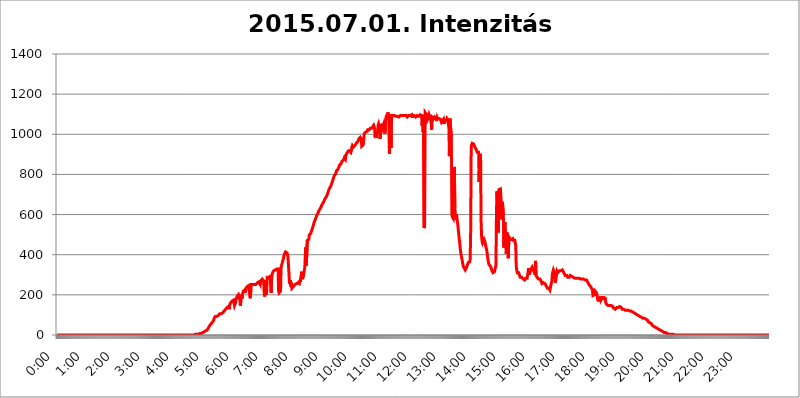
| Category | 2015.07.01. Intenzitás [W/m^2] |
|---|---|
| 0.0 | 0 |
| 0.0006944444444444445 | 0 |
| 0.001388888888888889 | 0 |
| 0.0020833333333333333 | 0 |
| 0.002777777777777778 | 0 |
| 0.003472222222222222 | 0 |
| 0.004166666666666667 | 0 |
| 0.004861111111111111 | 0 |
| 0.005555555555555556 | 0 |
| 0.0062499999999999995 | 0 |
| 0.006944444444444444 | 0 |
| 0.007638888888888889 | 0 |
| 0.008333333333333333 | 0 |
| 0.009027777777777779 | 0 |
| 0.009722222222222222 | 0 |
| 0.010416666666666666 | 0 |
| 0.011111111111111112 | 0 |
| 0.011805555555555555 | 0 |
| 0.012499999999999999 | 0 |
| 0.013194444444444444 | 0 |
| 0.013888888888888888 | 0 |
| 0.014583333333333332 | 0 |
| 0.015277777777777777 | 0 |
| 0.015972222222222224 | 0 |
| 0.016666666666666666 | 0 |
| 0.017361111111111112 | 0 |
| 0.018055555555555557 | 0 |
| 0.01875 | 0 |
| 0.019444444444444445 | 0 |
| 0.02013888888888889 | 0 |
| 0.020833333333333332 | 0 |
| 0.02152777777777778 | 0 |
| 0.022222222222222223 | 0 |
| 0.02291666666666667 | 0 |
| 0.02361111111111111 | 0 |
| 0.024305555555555556 | 0 |
| 0.024999999999999998 | 0 |
| 0.025694444444444447 | 0 |
| 0.02638888888888889 | 0 |
| 0.027083333333333334 | 0 |
| 0.027777777777777776 | 0 |
| 0.02847222222222222 | 0 |
| 0.029166666666666664 | 0 |
| 0.029861111111111113 | 0 |
| 0.030555555555555555 | 0 |
| 0.03125 | 0 |
| 0.03194444444444445 | 0 |
| 0.03263888888888889 | 0 |
| 0.03333333333333333 | 0 |
| 0.034027777777777775 | 0 |
| 0.034722222222222224 | 0 |
| 0.035416666666666666 | 0 |
| 0.036111111111111115 | 0 |
| 0.03680555555555556 | 0 |
| 0.0375 | 0 |
| 0.03819444444444444 | 0 |
| 0.03888888888888889 | 0 |
| 0.03958333333333333 | 0 |
| 0.04027777777777778 | 0 |
| 0.04097222222222222 | 0 |
| 0.041666666666666664 | 0 |
| 0.042361111111111106 | 0 |
| 0.04305555555555556 | 0 |
| 0.043750000000000004 | 0 |
| 0.044444444444444446 | 0 |
| 0.04513888888888889 | 0 |
| 0.04583333333333334 | 0 |
| 0.04652777777777778 | 0 |
| 0.04722222222222222 | 0 |
| 0.04791666666666666 | 0 |
| 0.04861111111111111 | 0 |
| 0.049305555555555554 | 0 |
| 0.049999999999999996 | 0 |
| 0.05069444444444445 | 0 |
| 0.051388888888888894 | 0 |
| 0.052083333333333336 | 0 |
| 0.05277777777777778 | 0 |
| 0.05347222222222222 | 0 |
| 0.05416666666666667 | 0 |
| 0.05486111111111111 | 0 |
| 0.05555555555555555 | 0 |
| 0.05625 | 0 |
| 0.05694444444444444 | 0 |
| 0.057638888888888885 | 0 |
| 0.05833333333333333 | 0 |
| 0.05902777777777778 | 0 |
| 0.059722222222222225 | 0 |
| 0.06041666666666667 | 0 |
| 0.061111111111111116 | 0 |
| 0.06180555555555556 | 0 |
| 0.0625 | 0 |
| 0.06319444444444444 | 0 |
| 0.06388888888888888 | 0 |
| 0.06458333333333334 | 0 |
| 0.06527777777777778 | 0 |
| 0.06597222222222222 | 0 |
| 0.06666666666666667 | 0 |
| 0.06736111111111111 | 0 |
| 0.06805555555555555 | 0 |
| 0.06874999999999999 | 0 |
| 0.06944444444444443 | 0 |
| 0.07013888888888889 | 0 |
| 0.07083333333333333 | 0 |
| 0.07152777777777779 | 0 |
| 0.07222222222222223 | 0 |
| 0.07291666666666667 | 0 |
| 0.07361111111111111 | 0 |
| 0.07430555555555556 | 0 |
| 0.075 | 0 |
| 0.07569444444444444 | 0 |
| 0.0763888888888889 | 0 |
| 0.07708333333333334 | 0 |
| 0.07777777777777778 | 0 |
| 0.07847222222222222 | 0 |
| 0.07916666666666666 | 0 |
| 0.0798611111111111 | 0 |
| 0.08055555555555556 | 0 |
| 0.08125 | 0 |
| 0.08194444444444444 | 0 |
| 0.08263888888888889 | 0 |
| 0.08333333333333333 | 0 |
| 0.08402777777777777 | 0 |
| 0.08472222222222221 | 0 |
| 0.08541666666666665 | 0 |
| 0.08611111111111112 | 0 |
| 0.08680555555555557 | 0 |
| 0.08750000000000001 | 0 |
| 0.08819444444444445 | 0 |
| 0.08888888888888889 | 0 |
| 0.08958333333333333 | 0 |
| 0.09027777777777778 | 0 |
| 0.09097222222222222 | 0 |
| 0.09166666666666667 | 0 |
| 0.09236111111111112 | 0 |
| 0.09305555555555556 | 0 |
| 0.09375 | 0 |
| 0.09444444444444444 | 0 |
| 0.09513888888888888 | 0 |
| 0.09583333333333333 | 0 |
| 0.09652777777777777 | 0 |
| 0.09722222222222222 | 0 |
| 0.09791666666666667 | 0 |
| 0.09861111111111111 | 0 |
| 0.09930555555555555 | 0 |
| 0.09999999999999999 | 0 |
| 0.10069444444444443 | 0 |
| 0.1013888888888889 | 0 |
| 0.10208333333333335 | 0 |
| 0.10277777777777779 | 0 |
| 0.10347222222222223 | 0 |
| 0.10416666666666667 | 0 |
| 0.10486111111111111 | 0 |
| 0.10555555555555556 | 0 |
| 0.10625 | 0 |
| 0.10694444444444444 | 0 |
| 0.1076388888888889 | 0 |
| 0.10833333333333334 | 0 |
| 0.10902777777777778 | 0 |
| 0.10972222222222222 | 0 |
| 0.1111111111111111 | 0 |
| 0.11180555555555556 | 0 |
| 0.11180555555555556 | 0 |
| 0.1125 | 0 |
| 0.11319444444444444 | 0 |
| 0.11388888888888889 | 0 |
| 0.11458333333333333 | 0 |
| 0.11527777777777777 | 0 |
| 0.11597222222222221 | 0 |
| 0.11666666666666665 | 0 |
| 0.1173611111111111 | 0 |
| 0.11805555555555557 | 0 |
| 0.11944444444444445 | 0 |
| 0.12013888888888889 | 0 |
| 0.12083333333333333 | 0 |
| 0.12152777777777778 | 0 |
| 0.12222222222222223 | 0 |
| 0.12291666666666667 | 0 |
| 0.12291666666666667 | 0 |
| 0.12361111111111112 | 0 |
| 0.12430555555555556 | 0 |
| 0.125 | 0 |
| 0.12569444444444444 | 0 |
| 0.12638888888888888 | 0 |
| 0.12708333333333333 | 0 |
| 0.16875 | 0 |
| 0.12847222222222224 | 0 |
| 0.12916666666666668 | 0 |
| 0.12986111111111112 | 0 |
| 0.13055555555555556 | 0 |
| 0.13125 | 0 |
| 0.13194444444444445 | 0 |
| 0.1326388888888889 | 0 |
| 0.13333333333333333 | 0 |
| 0.13402777777777777 | 0 |
| 0.13402777777777777 | 0 |
| 0.13472222222222222 | 0 |
| 0.13541666666666666 | 0 |
| 0.1361111111111111 | 0 |
| 0.13749999999999998 | 0 |
| 0.13819444444444443 | 0 |
| 0.1388888888888889 | 0 |
| 0.13958333333333334 | 0 |
| 0.14027777777777778 | 0 |
| 0.14097222222222222 | 0 |
| 0.14166666666666666 | 0 |
| 0.1423611111111111 | 0 |
| 0.14305555555555557 | 0 |
| 0.14375000000000002 | 0 |
| 0.14444444444444446 | 0 |
| 0.1451388888888889 | 0 |
| 0.1451388888888889 | 0 |
| 0.14652777777777778 | 0 |
| 0.14722222222222223 | 0 |
| 0.14791666666666667 | 0 |
| 0.1486111111111111 | 0 |
| 0.14930555555555555 | 0 |
| 0.15 | 0 |
| 0.15069444444444444 | 0 |
| 0.15138888888888888 | 0 |
| 0.15208333333333332 | 0 |
| 0.15277777777777776 | 0 |
| 0.15347222222222223 | 0 |
| 0.15416666666666667 | 0 |
| 0.15486111111111112 | 0 |
| 0.15555555555555556 | 0 |
| 0.15625 | 0 |
| 0.15694444444444444 | 0 |
| 0.15763888888888888 | 0 |
| 0.15833333333333333 | 0 |
| 0.15902777777777777 | 0 |
| 0.15972222222222224 | 0 |
| 0.16041666666666668 | 0 |
| 0.16111111111111112 | 0 |
| 0.16180555555555556 | 0 |
| 0.1625 | 0 |
| 0.16319444444444445 | 0 |
| 0.1638888888888889 | 0 |
| 0.16458333333333333 | 0 |
| 0.16527777777777777 | 0 |
| 0.16597222222222222 | 0 |
| 0.16666666666666666 | 0 |
| 0.1673611111111111 | 0 |
| 0.16805555555555554 | 0 |
| 0.16874999999999998 | 0 |
| 0.16944444444444443 | 0 |
| 0.17013888888888887 | 0 |
| 0.1708333333333333 | 0 |
| 0.17152777777777775 | 0 |
| 0.17222222222222225 | 0 |
| 0.1729166666666667 | 0 |
| 0.17361111111111113 | 0 |
| 0.17430555555555557 | 0 |
| 0.17500000000000002 | 0 |
| 0.17569444444444446 | 0 |
| 0.1763888888888889 | 0 |
| 0.17708333333333334 | 0 |
| 0.17777777777777778 | 0 |
| 0.17847222222222223 | 0 |
| 0.17916666666666667 | 0 |
| 0.1798611111111111 | 0 |
| 0.18055555555555555 | 0 |
| 0.18125 | 0 |
| 0.18194444444444444 | 0 |
| 0.1826388888888889 | 0 |
| 0.18333333333333335 | 0 |
| 0.1840277777777778 | 0 |
| 0.18472222222222223 | 0 |
| 0.18541666666666667 | 0 |
| 0.18611111111111112 | 0 |
| 0.18680555555555556 | 0 |
| 0.1875 | 0 |
| 0.18819444444444444 | 0 |
| 0.18888888888888888 | 0 |
| 0.18958333333333333 | 0 |
| 0.19027777777777777 | 0 |
| 0.1909722222222222 | 0 |
| 0.19166666666666665 | 0 |
| 0.19236111111111112 | 0 |
| 0.19305555555555554 | 0 |
| 0.19375 | 3.525 |
| 0.19444444444444445 | 3.525 |
| 0.1951388888888889 | 3.525 |
| 0.19583333333333333 | 3.525 |
| 0.19652777777777777 | 3.525 |
| 0.19722222222222222 | 3.525 |
| 0.19791666666666666 | 3.525 |
| 0.1986111111111111 | 3.525 |
| 0.19930555555555554 | 7.887 |
| 0.19999999999999998 | 7.887 |
| 0.20069444444444443 | 7.887 |
| 0.20138888888888887 | 7.887 |
| 0.2020833333333333 | 7.887 |
| 0.2027777777777778 | 12.257 |
| 0.2034722222222222 | 12.257 |
| 0.2041666666666667 | 12.257 |
| 0.20486111111111113 | 12.257 |
| 0.20555555555555557 | 12.257 |
| 0.20625000000000002 | 16.636 |
| 0.20694444444444446 | 16.636 |
| 0.2076388888888889 | 16.636 |
| 0.20833333333333334 | 21.024 |
| 0.20902777777777778 | 21.024 |
| 0.20972222222222223 | 25.419 |
| 0.21041666666666667 | 25.419 |
| 0.2111111111111111 | 29.823 |
| 0.21180555555555555 | 29.823 |
| 0.2125 | 38.653 |
| 0.21319444444444444 | 43.079 |
| 0.2138888888888889 | 47.511 |
| 0.21458333333333335 | 47.511 |
| 0.2152777777777778 | 51.951 |
| 0.21597222222222223 | 56.398 |
| 0.21666666666666667 | 56.398 |
| 0.21736111111111112 | 60.85 |
| 0.21805555555555556 | 65.31 |
| 0.21875 | 69.775 |
| 0.21944444444444444 | 74.246 |
| 0.22013888888888888 | 83.205 |
| 0.22083333333333333 | 87.692 |
| 0.22152777777777777 | 92.184 |
| 0.2222222222222222 | 92.184 |
| 0.22291666666666665 | 92.184 |
| 0.2236111111111111 | 92.184 |
| 0.22430555555555556 | 96.682 |
| 0.225 | 96.682 |
| 0.22569444444444445 | 96.682 |
| 0.2263888888888889 | 101.184 |
| 0.22708333333333333 | 101.184 |
| 0.22777777777777777 | 105.69 |
| 0.22847222222222222 | 105.69 |
| 0.22916666666666666 | 105.69 |
| 0.2298611111111111 | 105.69 |
| 0.23055555555555554 | 105.69 |
| 0.23124999999999998 | 110.201 |
| 0.23194444444444443 | 110.201 |
| 0.23263888888888887 | 114.716 |
| 0.2333333333333333 | 114.716 |
| 0.2340277777777778 | 119.235 |
| 0.2347222222222222 | 119.235 |
| 0.2354166666666667 | 123.758 |
| 0.23611111111111113 | 128.284 |
| 0.23680555555555557 | 128.284 |
| 0.23750000000000002 | 132.814 |
| 0.23819444444444446 | 137.347 |
| 0.2388888888888889 | 137.347 |
| 0.23958333333333334 | 137.347 |
| 0.24027777777777778 | 141.884 |
| 0.24097222222222223 | 128.284 |
| 0.24166666666666667 | 146.423 |
| 0.2423611111111111 | 141.884 |
| 0.24305555555555555 | 160.056 |
| 0.24375 | 160.056 |
| 0.24444444444444446 | 164.605 |
| 0.24513888888888888 | 169.156 |
| 0.24583333333333335 | 173.709 |
| 0.2465277777777778 | 173.709 |
| 0.24722222222222223 | 173.709 |
| 0.24791666666666667 | 173.709 |
| 0.24861111111111112 | 146.423 |
| 0.24930555555555556 | 141.884 |
| 0.25 | 160.056 |
| 0.25069444444444444 | 173.709 |
| 0.2513888888888889 | 182.82 |
| 0.2520833333333333 | 191.937 |
| 0.25277777777777777 | 196.497 |
| 0.2534722222222222 | 196.497 |
| 0.25416666666666665 | 201.058 |
| 0.2548611111111111 | 201.058 |
| 0.2555555555555556 | 201.058 |
| 0.25625000000000003 | 173.709 |
| 0.2569444444444445 | 146.423 |
| 0.2576388888888889 | 182.82 |
| 0.25833333333333336 | 201.058 |
| 0.2590277777777778 | 182.82 |
| 0.25972222222222224 | 201.058 |
| 0.2604166666666667 | 210.182 |
| 0.2611111111111111 | 219.309 |
| 0.26180555555555557 | 223.873 |
| 0.2625 | 223.873 |
| 0.26319444444444445 | 223.873 |
| 0.2638888888888889 | 210.182 |
| 0.26458333333333334 | 233 |
| 0.2652777777777778 | 237.564 |
| 0.2659722222222222 | 237.564 |
| 0.26666666666666666 | 242.127 |
| 0.2673611111111111 | 242.127 |
| 0.26805555555555555 | 242.127 |
| 0.26875 | 246.689 |
| 0.26944444444444443 | 246.689 |
| 0.2701388888888889 | 191.937 |
| 0.2708333333333333 | 182.82 |
| 0.27152777777777776 | 233 |
| 0.2722222222222222 | 251.251 |
| 0.27291666666666664 | 251.251 |
| 0.2736111111111111 | 251.251 |
| 0.2743055555555555 | 251.251 |
| 0.27499999999999997 | 255.813 |
| 0.27569444444444446 | 251.251 |
| 0.27638888888888885 | 251.251 |
| 0.27708333333333335 | 251.251 |
| 0.2777777777777778 | 251.251 |
| 0.27847222222222223 | 251.251 |
| 0.2791666666666667 | 255.813 |
| 0.2798611111111111 | 255.813 |
| 0.28055555555555556 | 260.373 |
| 0.28125 | 260.373 |
| 0.28194444444444444 | 264.932 |
| 0.2826388888888889 | 264.932 |
| 0.2833333333333333 | 269.49 |
| 0.28402777777777777 | 269.49 |
| 0.2847222222222222 | 251.251 |
| 0.28541666666666665 | 269.49 |
| 0.28611111111111115 | 274.047 |
| 0.28680555555555554 | 274.047 |
| 0.28750000000000003 | 278.603 |
| 0.2881944444444445 | 274.047 |
| 0.2888888888888889 | 274.047 |
| 0.28958333333333336 | 269.49 |
| 0.2902777777777778 | 205.62 |
| 0.29097222222222224 | 191.937 |
| 0.2916666666666667 | 223.873 |
| 0.2923611111111111 | 274.047 |
| 0.29305555555555557 | 201.058 |
| 0.29375 | 219.309 |
| 0.29444444444444445 | 287.709 |
| 0.2951388888888889 | 292.259 |
| 0.29583333333333334 | 292.259 |
| 0.2965277777777778 | 287.709 |
| 0.2972222222222222 | 287.709 |
| 0.29791666666666666 | 287.709 |
| 0.2986111111111111 | 292.259 |
| 0.29930555555555555 | 287.709 |
| 0.3 | 210.182 |
| 0.30069444444444443 | 278.603 |
| 0.3013888888888889 | 301.354 |
| 0.3020833333333333 | 310.44 |
| 0.30277777777777776 | 314.98 |
| 0.3034722222222222 | 319.517 |
| 0.30416666666666664 | 324.052 |
| 0.3048611111111111 | 324.052 |
| 0.3055555555555555 | 324.052 |
| 0.30624999999999997 | 328.584 |
| 0.3069444444444444 | 328.584 |
| 0.3076388888888889 | 328.584 |
| 0.30833333333333335 | 328.584 |
| 0.3090277777777778 | 328.584 |
| 0.30972222222222223 | 328.584 |
| 0.3104166666666667 | 219.309 |
| 0.3111111111111111 | 210.182 |
| 0.31180555555555556 | 205.62 |
| 0.3125 | 210.182 |
| 0.31319444444444444 | 219.309 |
| 0.3138888888888889 | 337.639 |
| 0.3145833333333333 | 346.682 |
| 0.31527777777777777 | 351.198 |
| 0.3159722222222222 | 364.728 |
| 0.31666666666666665 | 373.729 |
| 0.31736111111111115 | 382.715 |
| 0.31805555555555554 | 396.164 |
| 0.31875000000000003 | 405.108 |
| 0.3194444444444445 | 405.108 |
| 0.3201388888888889 | 414.035 |
| 0.32083333333333336 | 414.035 |
| 0.3215277777777778 | 414.035 |
| 0.32222222222222224 | 409.574 |
| 0.3229166666666667 | 400.638 |
| 0.3236111111111111 | 387.202 |
| 0.32430555555555557 | 382.715 |
| 0.325 | 305.898 |
| 0.32569444444444445 | 255.813 |
| 0.3263888888888889 | 255.813 |
| 0.32708333333333334 | 274.047 |
| 0.3277777777777778 | 242.127 |
| 0.3284722222222222 | 260.373 |
| 0.32916666666666666 | 233 |
| 0.3298611111111111 | 228.436 |
| 0.33055555555555555 | 233 |
| 0.33125 | 242.127 |
| 0.33194444444444443 | 242.127 |
| 0.3326388888888889 | 242.127 |
| 0.3333333333333333 | 251.251 |
| 0.3340277777777778 | 255.813 |
| 0.3347222222222222 | 251.251 |
| 0.3354166666666667 | 255.813 |
| 0.3361111111111111 | 255.813 |
| 0.3368055555555556 | 255.813 |
| 0.33749999999999997 | 260.373 |
| 0.33819444444444446 | 260.373 |
| 0.33888888888888885 | 260.373 |
| 0.33958333333333335 | 255.813 |
| 0.34027777777777773 | 274.047 |
| 0.34097222222222223 | 264.932 |
| 0.3416666666666666 | 264.932 |
| 0.3423611111111111 | 269.49 |
| 0.3430555555555555 | 314.98 |
| 0.34375 | 278.603 |
| 0.3444444444444445 | 274.047 |
| 0.3451388888888889 | 292.259 |
| 0.3458333333333334 | 287.709 |
| 0.34652777777777777 | 287.709 |
| 0.34722222222222227 | 337.639 |
| 0.34791666666666665 | 400.638 |
| 0.34861111111111115 | 436.27 |
| 0.34930555555555554 | 346.682 |
| 0.35000000000000003 | 346.682 |
| 0.3506944444444444 | 471.582 |
| 0.3513888888888889 | 471.582 |
| 0.3520833333333333 | 475.972 |
| 0.3527777777777778 | 475.972 |
| 0.3534722222222222 | 497.836 |
| 0.3541666666666667 | 497.836 |
| 0.3548611111111111 | 502.192 |
| 0.35555555555555557 | 506.542 |
| 0.35625 | 515.223 |
| 0.35694444444444445 | 519.555 |
| 0.3576388888888889 | 528.2 |
| 0.35833333333333334 | 536.82 |
| 0.3590277777777778 | 545.416 |
| 0.3597222222222222 | 553.986 |
| 0.36041666666666666 | 562.53 |
| 0.3611111111111111 | 566.793 |
| 0.36180555555555555 | 575.299 |
| 0.3625 | 579.542 |
| 0.36319444444444443 | 588.009 |
| 0.3638888888888889 | 592.233 |
| 0.3645833333333333 | 600.661 |
| 0.3652777777777778 | 604.864 |
| 0.3659722222222222 | 609.062 |
| 0.3666666666666667 | 617.436 |
| 0.3673611111111111 | 617.436 |
| 0.3680555555555556 | 621.613 |
| 0.36874999999999997 | 629.948 |
| 0.36944444444444446 | 634.105 |
| 0.37013888888888885 | 638.256 |
| 0.37083333333333335 | 646.537 |
| 0.37152777777777773 | 650.667 |
| 0.37222222222222223 | 654.791 |
| 0.3729166666666666 | 658.909 |
| 0.3736111111111111 | 663.019 |
| 0.3743055555555555 | 667.123 |
| 0.375 | 675.311 |
| 0.3756944444444445 | 679.395 |
| 0.3763888888888889 | 683.473 |
| 0.3770833333333334 | 687.544 |
| 0.37777777777777777 | 691.608 |
| 0.37847222222222227 | 695.666 |
| 0.37916666666666665 | 703.762 |
| 0.37986111111111115 | 711.832 |
| 0.38055555555555554 | 719.877 |
| 0.38125000000000003 | 723.889 |
| 0.3819444444444444 | 731.896 |
| 0.3826388888888889 | 735.89 |
| 0.3833333333333333 | 739.877 |
| 0.3840277777777778 | 743.859 |
| 0.3847222222222222 | 751.803 |
| 0.3854166666666667 | 759.723 |
| 0.3861111111111111 | 767.62 |
| 0.38680555555555557 | 775.492 |
| 0.3875 | 783.342 |
| 0.38819444444444445 | 791.169 |
| 0.3888888888888889 | 795.074 |
| 0.38958333333333334 | 798.974 |
| 0.3902777777777778 | 802.868 |
| 0.3909722222222222 | 806.757 |
| 0.39166666666666666 | 818.392 |
| 0.3923611111111111 | 818.392 |
| 0.39305555555555555 | 822.26 |
| 0.39375 | 826.123 |
| 0.39444444444444443 | 829.981 |
| 0.3951388888888889 | 837.682 |
| 0.3958333333333333 | 845.365 |
| 0.3965277777777778 | 845.365 |
| 0.3972222222222222 | 845.365 |
| 0.3979166666666667 | 853.029 |
| 0.3986111111111111 | 860.676 |
| 0.3993055555555556 | 864.493 |
| 0.39999999999999997 | 868.305 |
| 0.40069444444444446 | 868.305 |
| 0.40138888888888885 | 868.305 |
| 0.40208333333333335 | 875.918 |
| 0.40277777777777773 | 883.516 |
| 0.40347222222222223 | 883.516 |
| 0.4041666666666666 | 875.918 |
| 0.4048611111111111 | 894.885 |
| 0.4055555555555555 | 898.668 |
| 0.40625 | 906.223 |
| 0.4069444444444445 | 909.996 |
| 0.4076388888888889 | 909.996 |
| 0.4083333333333334 | 917.534 |
| 0.40902777777777777 | 913.766 |
| 0.40972222222222227 | 921.298 |
| 0.41041666666666665 | 917.534 |
| 0.41111111111111115 | 913.766 |
| 0.41180555555555554 | 909.996 |
| 0.41250000000000003 | 917.534 |
| 0.4131944444444444 | 936.33 |
| 0.4138888888888889 | 943.832 |
| 0.4145833333333333 | 943.832 |
| 0.4152777777777778 | 936.33 |
| 0.4159722222222222 | 936.33 |
| 0.4166666666666667 | 940.082 |
| 0.4173611111111111 | 943.832 |
| 0.41805555555555557 | 947.58 |
| 0.41875 | 951.327 |
| 0.41944444444444445 | 955.071 |
| 0.4201388888888889 | 958.814 |
| 0.42083333333333334 | 962.555 |
| 0.4215277777777778 | 962.555 |
| 0.4222222222222222 | 966.295 |
| 0.42291666666666666 | 977.508 |
| 0.4236111111111111 | 977.508 |
| 0.42430555555555555 | 981.244 |
| 0.425 | 984.98 |
| 0.42569444444444443 | 984.98 |
| 0.4263888888888889 | 977.508 |
| 0.4270833333333333 | 940.082 |
| 0.4277777777777778 | 936.33 |
| 0.4284722222222222 | 936.33 |
| 0.4291666666666667 | 947.58 |
| 0.4298611111111111 | 970.034 |
| 0.4305555555555556 | 1003.65 |
| 0.43124999999999997 | 1007.383 |
| 0.43194444444444446 | 1007.383 |
| 0.43263888888888885 | 1011.118 |
| 0.43333333333333335 | 1014.852 |
| 0.43402777777777773 | 1011.118 |
| 0.43472222222222223 | 1014.852 |
| 0.4354166666666666 | 1022.323 |
| 0.4361111111111111 | 1022.323 |
| 0.4368055555555555 | 1022.323 |
| 0.4375 | 1022.323 |
| 0.4381944444444445 | 1026.06 |
| 0.4388888888888889 | 1029.798 |
| 0.4395833333333334 | 1029.798 |
| 0.44027777777777777 | 1029.798 |
| 0.44097222222222227 | 1029.798 |
| 0.44166666666666665 | 1033.537 |
| 0.44236111111111115 | 1037.277 |
| 0.44305555555555554 | 1037.277 |
| 0.44375000000000003 | 1044.762 |
| 0.4444444444444444 | 1037.277 |
| 0.4451388888888889 | 1029.798 |
| 0.4458333333333333 | 984.98 |
| 0.4465277777777778 | 1007.383 |
| 0.4472222222222222 | 981.244 |
| 0.4479166666666667 | 1007.383 |
| 0.4486111111111111 | 1003.65 |
| 0.44930555555555557 | 1014.852 |
| 0.45 | 1044.762 |
| 0.45069444444444445 | 1052.255 |
| 0.4513888888888889 | 1048.508 |
| 0.45208333333333334 | 1029.798 |
| 0.4527777777777778 | 977.508 |
| 0.4534722222222222 | 1029.798 |
| 0.45416666666666666 | 1052.255 |
| 0.4548611111111111 | 1052.255 |
| 0.45555555555555555 | 1048.508 |
| 0.45625 | 1029.798 |
| 0.45694444444444443 | 1041.019 |
| 0.4576388888888889 | 1048.508 |
| 0.4583333333333333 | 1037.277 |
| 0.4590277777777778 | 1041.019 |
| 0.4597222222222222 | 1003.65 |
| 0.4604166666666667 | 1071.027 |
| 0.4611111111111111 | 1082.324 |
| 0.4618055555555556 | 1097.437 |
| 0.46249999999999997 | 1101.226 |
| 0.46319444444444446 | 1082.324 |
| 0.46388888888888885 | 1108.816 |
| 0.46458333333333335 | 1071.027 |
| 0.46527777777777773 | 1093.653 |
| 0.46597222222222223 | 902.447 |
| 0.4666666666666666 | 1093.653 |
| 0.4673611111111111 | 1101.226 |
| 0.4680555555555555 | 932.576 |
| 0.46875 | 1082.324 |
| 0.4694444444444445 | 1082.324 |
| 0.4701388888888889 | 1086.097 |
| 0.4708333333333334 | 1093.653 |
| 0.47152777777777777 | 1093.653 |
| 0.47222222222222227 | 1093.653 |
| 0.47291666666666665 | 1093.653 |
| 0.47361111111111115 | 1089.873 |
| 0.47430555555555554 | 1089.873 |
| 0.47500000000000003 | 1089.873 |
| 0.4756944444444444 | 1089.873 |
| 0.4763888888888889 | 1089.873 |
| 0.4770833333333333 | 1089.873 |
| 0.4777777777777778 | 1089.873 |
| 0.4784722222222222 | 1089.873 |
| 0.4791666666666667 | 1086.097 |
| 0.4798611111111111 | 1086.097 |
| 0.48055555555555557 | 1089.873 |
| 0.48125 | 1093.653 |
| 0.48194444444444445 | 1093.653 |
| 0.4826388888888889 | 1093.653 |
| 0.48333333333333334 | 1093.653 |
| 0.4840277777777778 | 1093.653 |
| 0.4847222222222222 | 1093.653 |
| 0.48541666666666666 | 1093.653 |
| 0.4861111111111111 | 1093.653 |
| 0.48680555555555555 | 1093.653 |
| 0.4875 | 1093.653 |
| 0.48819444444444443 | 1093.653 |
| 0.4888888888888889 | 1093.653 |
| 0.4895833333333333 | 1093.653 |
| 0.4902777777777778 | 1093.653 |
| 0.4909722222222222 | 1086.097 |
| 0.4916666666666667 | 1089.873 |
| 0.4923611111111111 | 1086.097 |
| 0.4930555555555556 | 1093.653 |
| 0.49374999999999997 | 1093.653 |
| 0.49444444444444446 | 1097.437 |
| 0.49513888888888885 | 1093.653 |
| 0.49583333333333335 | 1093.653 |
| 0.49652777777777773 | 1097.437 |
| 0.49722222222222223 | 1097.437 |
| 0.4979166666666666 | 1082.324 |
| 0.4986111111111111 | 1089.873 |
| 0.4993055555555555 | 1093.653 |
| 0.5 | 1086.097 |
| 0.5006944444444444 | 1093.653 |
| 0.5013888888888889 | 1097.437 |
| 0.5020833333333333 | 1093.653 |
| 0.5027777777777778 | 1086.097 |
| 0.5034722222222222 | 1082.324 |
| 0.5041666666666667 | 1082.324 |
| 0.5048611111111111 | 1093.653 |
| 0.5055555555555555 | 1093.653 |
| 0.50625 | 1097.437 |
| 0.5069444444444444 | 1089.873 |
| 0.5076388888888889 | 1093.653 |
| 0.5083333333333333 | 1093.653 |
| 0.5090277777777777 | 1097.437 |
| 0.5097222222222222 | 1101.226 |
| 0.5104166666666666 | 1097.437 |
| 0.5111111111111112 | 1089.873 |
| 0.5118055555555555 | 1041.019 |
| 0.5125000000000001 | 1097.437 |
| 0.5131944444444444 | 1011.118 |
| 0.513888888888889 | 1029.798 |
| 0.5145833333333333 | 532.513 |
| 0.5152777777777778 | 545.416 |
| 0.5159722222222222 | 1108.816 |
| 0.5166666666666667 | 1108.816 |
| 0.517361111111111 | 1101.226 |
| 0.5180555555555556 | 1101.226 |
| 0.5187499999999999 | 1093.653 |
| 0.5194444444444445 | 1074.789 |
| 0.5201388888888888 | 1074.789 |
| 0.5208333333333334 | 1086.097 |
| 0.5215277777777778 | 1097.437 |
| 0.5222222222222223 | 1089.873 |
| 0.5229166666666667 | 1082.324 |
| 0.5236111111111111 | 1082.324 |
| 0.5243055555555556 | 1093.653 |
| 0.525 | 1022.323 |
| 0.5256944444444445 | 1086.097 |
| 0.5263888888888889 | 1082.324 |
| 0.5270833333333333 | 1082.324 |
| 0.5277777777777778 | 1078.555 |
| 0.5284722222222222 | 1082.324 |
| 0.5291666666666667 | 1086.097 |
| 0.5298611111111111 | 1089.873 |
| 0.5305555555555556 | 1078.555 |
| 0.53125 | 1089.873 |
| 0.5319444444444444 | 1071.027 |
| 0.5326388888888889 | 1082.324 |
| 0.5333333333333333 | 1074.789 |
| 0.5340277777777778 | 1074.789 |
| 0.5347222222222222 | 1074.789 |
| 0.5354166666666667 | 1078.555 |
| 0.5361111111111111 | 1074.789 |
| 0.5368055555555555 | 1074.789 |
| 0.5375 | 1074.789 |
| 0.5381944444444444 | 1067.267 |
| 0.5388888888888889 | 1059.756 |
| 0.5395833333333333 | 1059.756 |
| 0.5402777777777777 | 1067.267 |
| 0.5409722222222222 | 1071.027 |
| 0.5416666666666666 | 1074.789 |
| 0.5423611111111112 | 1052.255 |
| 0.5430555555555555 | 1074.789 |
| 0.5437500000000001 | 1063.51 |
| 0.5444444444444444 | 1063.51 |
| 0.545138888888889 | 1067.267 |
| 0.5458333333333333 | 1071.027 |
| 0.5465277777777778 | 1078.555 |
| 0.5472222222222222 | 1074.789 |
| 0.5479166666666667 | 1071.027 |
| 0.548611111111111 | 1074.789 |
| 0.5493055555555556 | 1029.798 |
| 0.5499999999999999 | 891.099 |
| 0.5506944444444445 | 1078.555 |
| 0.5513888888888888 | 1074.789 |
| 0.5520833333333334 | 1074.789 |
| 0.5527777777777778 | 984.98 |
| 0.5534722222222223 | 600.661 |
| 0.5541666666666667 | 588.009 |
| 0.5548611111111111 | 583.779 |
| 0.5555555555555556 | 579.542 |
| 0.55625 | 609.062 |
| 0.5569444444444445 | 837.682 |
| 0.5576388888888889 | 629.948 |
| 0.5583333333333333 | 604.864 |
| 0.5590277777777778 | 575.299 |
| 0.5597222222222222 | 600.661 |
| 0.5604166666666667 | 592.233 |
| 0.5611111111111111 | 566.793 |
| 0.5618055555555556 | 549.704 |
| 0.5625 | 523.88 |
| 0.5631944444444444 | 497.836 |
| 0.5638888888888889 | 475.972 |
| 0.5645833333333333 | 453.968 |
| 0.5652777777777778 | 427.39 |
| 0.5659722222222222 | 409.574 |
| 0.5666666666666667 | 396.164 |
| 0.5673611111111111 | 382.715 |
| 0.5680555555555555 | 369.23 |
| 0.56875 | 355.712 |
| 0.5694444444444444 | 342.162 |
| 0.5701388888888889 | 337.639 |
| 0.5708333333333333 | 333.113 |
| 0.5715277777777777 | 328.584 |
| 0.5722222222222222 | 324.052 |
| 0.5729166666666666 | 328.584 |
| 0.5736111111111112 | 333.113 |
| 0.5743055555555555 | 337.639 |
| 0.5750000000000001 | 346.682 |
| 0.5756944444444444 | 351.198 |
| 0.576388888888889 | 360.221 |
| 0.5770833333333333 | 360.221 |
| 0.5777777777777778 | 360.221 |
| 0.5784722222222222 | 364.728 |
| 0.5791666666666667 | 378.224 |
| 0.579861111111111 | 523.88 |
| 0.5805555555555556 | 936.33 |
| 0.5812499999999999 | 947.58 |
| 0.5819444444444445 | 955.071 |
| 0.5826388888888888 | 951.327 |
| 0.5833333333333334 | 955.071 |
| 0.5840277777777778 | 951.327 |
| 0.5847222222222223 | 947.58 |
| 0.5854166666666667 | 940.082 |
| 0.5861111111111111 | 932.576 |
| 0.5868055555555556 | 928.819 |
| 0.5875 | 925.06 |
| 0.5881944444444445 | 917.534 |
| 0.5888888888888889 | 909.996 |
| 0.5895833333333333 | 913.766 |
| 0.5902777777777778 | 909.996 |
| 0.5909722222222222 | 909.996 |
| 0.5916666666666667 | 763.674 |
| 0.5923611111111111 | 860.676 |
| 0.5930555555555556 | 902.447 |
| 0.59375 | 894.885 |
| 0.5944444444444444 | 566.793 |
| 0.5951388888888889 | 493.475 |
| 0.5958333333333333 | 467.187 |
| 0.5965277777777778 | 458.38 |
| 0.5972222222222222 | 458.38 |
| 0.5979166666666667 | 462.786 |
| 0.5986111111111111 | 475.972 |
| 0.5993055555555555 | 480.356 |
| 0.6 | 462.786 |
| 0.6006944444444444 | 449.551 |
| 0.6013888888888889 | 436.27 |
| 0.6020833333333333 | 427.39 |
| 0.6027777777777777 | 414.035 |
| 0.6034722222222222 | 391.685 |
| 0.6041666666666666 | 373.729 |
| 0.6048611111111112 | 360.221 |
| 0.6055555555555555 | 351.198 |
| 0.6062500000000001 | 351.198 |
| 0.6069444444444444 | 346.682 |
| 0.607638888888889 | 342.162 |
| 0.6083333333333333 | 337.639 |
| 0.6090277777777778 | 328.584 |
| 0.6097222222222222 | 319.517 |
| 0.6104166666666667 | 314.98 |
| 0.611111111111111 | 310.44 |
| 0.6118055555555556 | 310.44 |
| 0.6124999999999999 | 314.98 |
| 0.6131944444444445 | 314.98 |
| 0.6138888888888888 | 319.517 |
| 0.6145833333333334 | 337.639 |
| 0.6152777777777778 | 346.682 |
| 0.6159722222222223 | 600.661 |
| 0.6166666666666667 | 715.858 |
| 0.6173611111111111 | 675.311 |
| 0.6180555555555556 | 532.513 |
| 0.61875 | 510.885 |
| 0.6194444444444445 | 723.889 |
| 0.6201388888888889 | 723.889 |
| 0.6208333333333333 | 719.877 |
| 0.6215277777777778 | 727.896 |
| 0.6222222222222222 | 723.889 |
| 0.6229166666666667 | 650.667 |
| 0.6236111111111111 | 575.299 |
| 0.6243055555555556 | 663.019 |
| 0.625 | 667.123 |
| 0.6256944444444444 | 600.661 |
| 0.6263888888888889 | 436.27 |
| 0.6270833333333333 | 528.2 |
| 0.6277777777777778 | 562.53 |
| 0.6284722222222222 | 558.261 |
| 0.6291666666666667 | 449.551 |
| 0.6298611111111111 | 405.108 |
| 0.6305555555555555 | 510.885 |
| 0.63125 | 510.885 |
| 0.6319444444444444 | 462.786 |
| 0.6326388888888889 | 382.715 |
| 0.6333333333333333 | 489.108 |
| 0.6340277777777777 | 489.108 |
| 0.6347222222222222 | 480.356 |
| 0.6354166666666666 | 475.972 |
| 0.6361111111111112 | 475.972 |
| 0.6368055555555555 | 475.972 |
| 0.6375000000000001 | 471.582 |
| 0.6381944444444444 | 471.582 |
| 0.638888888888889 | 480.356 |
| 0.6395833333333333 | 471.582 |
| 0.6402777777777778 | 471.582 |
| 0.6409722222222222 | 471.582 |
| 0.6416666666666667 | 471.582 |
| 0.642361111111111 | 467.187 |
| 0.6430555555555556 | 445.129 |
| 0.6437499999999999 | 342.162 |
| 0.6444444444444445 | 324.052 |
| 0.6451388888888888 | 310.44 |
| 0.6458333333333334 | 305.898 |
| 0.6465277777777778 | 305.898 |
| 0.6472222222222223 | 310.44 |
| 0.6479166666666667 | 301.354 |
| 0.6486111111111111 | 296.808 |
| 0.6493055555555556 | 287.709 |
| 0.65 | 287.709 |
| 0.6506944444444445 | 292.259 |
| 0.6513888888888889 | 287.709 |
| 0.6520833333333333 | 287.709 |
| 0.6527777777777778 | 283.156 |
| 0.6534722222222222 | 278.603 |
| 0.6541666666666667 | 274.047 |
| 0.6548611111111111 | 278.603 |
| 0.6555555555555556 | 274.047 |
| 0.65625 | 278.603 |
| 0.6569444444444444 | 283.156 |
| 0.6576388888888889 | 283.156 |
| 0.6583333333333333 | 283.156 |
| 0.6590277777777778 | 283.156 |
| 0.6597222222222222 | 283.156 |
| 0.6604166666666667 | 287.709 |
| 0.6611111111111111 | 333.113 |
| 0.6618055555555555 | 301.354 |
| 0.6625 | 305.898 |
| 0.6631944444444444 | 314.98 |
| 0.6638888888888889 | 319.517 |
| 0.6645833333333333 | 328.584 |
| 0.6652777777777777 | 333.113 |
| 0.6659722222222222 | 337.639 |
| 0.6666666666666666 | 333.113 |
| 0.6673611111111111 | 324.052 |
| 0.6680555555555556 | 324.052 |
| 0.6687500000000001 | 319.517 |
| 0.6694444444444444 | 310.44 |
| 0.6701388888888888 | 301.354 |
| 0.6708333333333334 | 369.23 |
| 0.6715277777777778 | 296.808 |
| 0.6722222222222222 | 301.354 |
| 0.6729166666666666 | 287.709 |
| 0.6736111111111112 | 287.709 |
| 0.6743055555555556 | 283.156 |
| 0.6749999999999999 | 278.603 |
| 0.6756944444444444 | 278.603 |
| 0.6763888888888889 | 278.603 |
| 0.6770833333333334 | 278.603 |
| 0.6777777777777777 | 274.047 |
| 0.6784722222222223 | 269.49 |
| 0.6791666666666667 | 274.047 |
| 0.6798611111111111 | 255.813 |
| 0.6805555555555555 | 255.813 |
| 0.68125 | 260.373 |
| 0.6819444444444445 | 260.373 |
| 0.6826388888888889 | 260.373 |
| 0.6833333333333332 | 260.373 |
| 0.6840277777777778 | 255.813 |
| 0.6847222222222222 | 251.251 |
| 0.6854166666666667 | 246.689 |
| 0.686111111111111 | 246.689 |
| 0.6868055555555556 | 242.127 |
| 0.6875 | 233 |
| 0.6881944444444444 | 233 |
| 0.688888888888889 | 233 |
| 0.6895833333333333 | 233 |
| 0.6902777777777778 | 228.436 |
| 0.6909722222222222 | 223.873 |
| 0.6916666666666668 | 223.873 |
| 0.6923611111111111 | 219.309 |
| 0.6930555555555555 | 260.373 |
| 0.69375 | 269.49 |
| 0.6944444444444445 | 305.898 |
| 0.6951388888888889 | 314.98 |
| 0.6958333333333333 | 324.052 |
| 0.6965277777777777 | 324.052 |
| 0.6972222222222223 | 328.584 |
| 0.6979166666666666 | 301.354 |
| 0.6986111111111111 | 260.373 |
| 0.6993055555555556 | 260.373 |
| 0.7000000000000001 | 305.898 |
| 0.7006944444444444 | 319.517 |
| 0.7013888888888888 | 314.98 |
| 0.7020833333333334 | 310.44 |
| 0.7027777777777778 | 314.98 |
| 0.7034722222222222 | 314.98 |
| 0.7041666666666666 | 319.517 |
| 0.7048611111111112 | 314.98 |
| 0.7055555555555556 | 319.517 |
| 0.7062499999999999 | 319.517 |
| 0.7069444444444444 | 324.052 |
| 0.7076388888888889 | 324.052 |
| 0.7083333333333334 | 324.052 |
| 0.7090277777777777 | 319.517 |
| 0.7097222222222223 | 314.98 |
| 0.7104166666666667 | 310.44 |
| 0.7111111111111111 | 305.898 |
| 0.7118055555555555 | 301.354 |
| 0.7125 | 296.808 |
| 0.7131944444444445 | 296.808 |
| 0.7138888888888889 | 296.808 |
| 0.7145833333333332 | 296.808 |
| 0.7152777777777778 | 292.259 |
| 0.7159722222222222 | 287.709 |
| 0.7166666666666667 | 287.709 |
| 0.717361111111111 | 287.709 |
| 0.7180555555555556 | 287.709 |
| 0.71875 | 292.259 |
| 0.7194444444444444 | 296.808 |
| 0.720138888888889 | 296.808 |
| 0.7208333333333333 | 292.259 |
| 0.7215277777777778 | 292.259 |
| 0.7222222222222222 | 292.259 |
| 0.7229166666666668 | 287.709 |
| 0.7236111111111111 | 287.709 |
| 0.7243055555555555 | 283.156 |
| 0.725 | 283.156 |
| 0.7256944444444445 | 283.156 |
| 0.7263888888888889 | 283.156 |
| 0.7270833333333333 | 283.156 |
| 0.7277777777777777 | 283.156 |
| 0.7284722222222223 | 278.603 |
| 0.7291666666666666 | 283.156 |
| 0.7298611111111111 | 283.156 |
| 0.7305555555555556 | 283.156 |
| 0.7312500000000001 | 283.156 |
| 0.7319444444444444 | 283.156 |
| 0.7326388888888888 | 278.603 |
| 0.7333333333333334 | 278.603 |
| 0.7340277777777778 | 278.603 |
| 0.7347222222222222 | 278.603 |
| 0.7354166666666666 | 278.603 |
| 0.7361111111111112 | 278.603 |
| 0.7368055555555556 | 278.603 |
| 0.7374999999999999 | 278.603 |
| 0.7381944444444444 | 278.603 |
| 0.7388888888888889 | 278.603 |
| 0.7395833333333334 | 278.603 |
| 0.7402777777777777 | 274.047 |
| 0.7409722222222223 | 269.49 |
| 0.7416666666666667 | 274.047 |
| 0.7423611111111111 | 274.047 |
| 0.7430555555555555 | 269.49 |
| 0.74375 | 269.49 |
| 0.7444444444444445 | 260.373 |
| 0.7451388888888889 | 255.813 |
| 0.7458333333333332 | 251.251 |
| 0.7465277777777778 | 251.251 |
| 0.7472222222222222 | 246.689 |
| 0.7479166666666667 | 242.127 |
| 0.748611111111111 | 237.564 |
| 0.7493055555555556 | 233 |
| 0.75 | 233 |
| 0.7506944444444444 | 223.873 |
| 0.751388888888889 | 196.497 |
| 0.7520833333333333 | 196.497 |
| 0.7527777777777778 | 191.937 |
| 0.7534722222222222 | 201.058 |
| 0.7541666666666668 | 219.309 |
| 0.7548611111111111 | 214.746 |
| 0.7555555555555555 | 219.309 |
| 0.75625 | 210.182 |
| 0.7569444444444445 | 201.058 |
| 0.7576388888888889 | 182.82 |
| 0.7583333333333333 | 173.709 |
| 0.7590277777777777 | 173.709 |
| 0.7597222222222223 | 173.709 |
| 0.7604166666666666 | 173.709 |
| 0.7611111111111111 | 178.264 |
| 0.7618055555555556 | 191.937 |
| 0.7625000000000001 | 173.709 |
| 0.7631944444444444 | 178.264 |
| 0.7638888888888888 | 173.709 |
| 0.7645833333333334 | 187.378 |
| 0.7652777777777778 | 191.937 |
| 0.7659722222222222 | 187.378 |
| 0.7666666666666666 | 187.378 |
| 0.7673611111111112 | 173.709 |
| 0.7680555555555556 | 187.378 |
| 0.7687499999999999 | 178.264 |
| 0.7694444444444444 | 160.056 |
| 0.7701388888888889 | 155.509 |
| 0.7708333333333334 | 150.964 |
| 0.7715277777777777 | 150.964 |
| 0.7722222222222223 | 146.423 |
| 0.7729166666666667 | 146.423 |
| 0.7736111111111111 | 146.423 |
| 0.7743055555555555 | 146.423 |
| 0.775 | 146.423 |
| 0.7756944444444445 | 141.884 |
| 0.7763888888888889 | 146.423 |
| 0.7770833333333332 | 146.423 |
| 0.7777777777777778 | 150.964 |
| 0.7784722222222222 | 146.423 |
| 0.7791666666666667 | 141.884 |
| 0.779861111111111 | 141.884 |
| 0.7805555555555556 | 132.814 |
| 0.78125 | 132.814 |
| 0.7819444444444444 | 128.284 |
| 0.782638888888889 | 128.284 |
| 0.7833333333333333 | 128.284 |
| 0.7840277777777778 | 132.814 |
| 0.7847222222222222 | 137.347 |
| 0.7854166666666668 | 137.347 |
| 0.7861111111111111 | 141.884 |
| 0.7868055555555555 | 137.347 |
| 0.7875 | 137.347 |
| 0.7881944444444445 | 137.347 |
| 0.7888888888888889 | 141.884 |
| 0.7895833333333333 | 141.884 |
| 0.7902777777777777 | 137.347 |
| 0.7909722222222223 | 137.347 |
| 0.7916666666666666 | 132.814 |
| 0.7923611111111111 | 128.284 |
| 0.7930555555555556 | 128.284 |
| 0.7937500000000001 | 128.284 |
| 0.7944444444444444 | 128.284 |
| 0.7951388888888888 | 123.758 |
| 0.7958333333333334 | 123.758 |
| 0.7965277777777778 | 123.758 |
| 0.7972222222222222 | 119.235 |
| 0.7979166666666666 | 119.235 |
| 0.7986111111111112 | 123.758 |
| 0.7993055555555556 | 123.758 |
| 0.7999999999999999 | 123.758 |
| 0.8006944444444444 | 123.758 |
| 0.8013888888888889 | 119.235 |
| 0.8020833333333334 | 119.235 |
| 0.8027777777777777 | 119.235 |
| 0.8034722222222223 | 119.235 |
| 0.8041666666666667 | 119.235 |
| 0.8048611111111111 | 119.235 |
| 0.8055555555555555 | 114.716 |
| 0.80625 | 114.716 |
| 0.8069444444444445 | 114.716 |
| 0.8076388888888889 | 114.716 |
| 0.8083333333333332 | 114.716 |
| 0.8090277777777778 | 110.201 |
| 0.8097222222222222 | 110.201 |
| 0.8104166666666667 | 105.69 |
| 0.811111111111111 | 105.69 |
| 0.8118055555555556 | 105.69 |
| 0.8125 | 101.184 |
| 0.8131944444444444 | 101.184 |
| 0.813888888888889 | 101.184 |
| 0.8145833333333333 | 96.682 |
| 0.8152777777777778 | 96.682 |
| 0.8159722222222222 | 92.184 |
| 0.8166666666666668 | 92.184 |
| 0.8173611111111111 | 92.184 |
| 0.8180555555555555 | 87.692 |
| 0.81875 | 87.692 |
| 0.8194444444444445 | 87.692 |
| 0.8201388888888889 | 87.692 |
| 0.8208333333333333 | 87.692 |
| 0.8215277777777777 | 83.205 |
| 0.8222222222222223 | 83.205 |
| 0.8229166666666666 | 83.205 |
| 0.8236111111111111 | 83.205 |
| 0.8243055555555556 | 83.205 |
| 0.8250000000000001 | 83.205 |
| 0.8256944444444444 | 78.722 |
| 0.8263888888888888 | 78.722 |
| 0.8270833333333334 | 74.246 |
| 0.8277777777777778 | 74.246 |
| 0.8284722222222222 | 69.775 |
| 0.8291666666666666 | 65.31 |
| 0.8298611111111112 | 65.31 |
| 0.8305555555555556 | 60.85 |
| 0.8312499999999999 | 60.85 |
| 0.8319444444444444 | 56.398 |
| 0.8326388888888889 | 56.398 |
| 0.8333333333333334 | 56.398 |
| 0.8340277777777777 | 51.951 |
| 0.8347222222222223 | 47.511 |
| 0.8354166666666667 | 47.511 |
| 0.8361111111111111 | 47.511 |
| 0.8368055555555555 | 43.079 |
| 0.8375 | 38.653 |
| 0.8381944444444445 | 38.653 |
| 0.8388888888888889 | 38.653 |
| 0.8395833333333332 | 34.234 |
| 0.8402777777777778 | 34.234 |
| 0.8409722222222222 | 34.234 |
| 0.8416666666666667 | 29.823 |
| 0.842361111111111 | 29.823 |
| 0.8430555555555556 | 29.823 |
| 0.84375 | 29.823 |
| 0.8444444444444444 | 25.419 |
| 0.845138888888889 | 25.419 |
| 0.8458333333333333 | 21.024 |
| 0.8465277777777778 | 21.024 |
| 0.8472222222222222 | 21.024 |
| 0.8479166666666668 | 21.024 |
| 0.8486111111111111 | 21.024 |
| 0.8493055555555555 | 16.636 |
| 0.85 | 16.636 |
| 0.8506944444444445 | 16.636 |
| 0.8513888888888889 | 12.257 |
| 0.8520833333333333 | 12.257 |
| 0.8527777777777777 | 12.257 |
| 0.8534722222222223 | 12.257 |
| 0.8541666666666666 | 12.257 |
| 0.8548611111111111 | 7.887 |
| 0.8555555555555556 | 7.887 |
| 0.8562500000000001 | 7.887 |
| 0.8569444444444444 | 7.887 |
| 0.8576388888888888 | 3.525 |
| 0.8583333333333334 | 3.525 |
| 0.8590277777777778 | 3.525 |
| 0.8597222222222222 | 3.525 |
| 0.8604166666666666 | 3.525 |
| 0.8611111111111112 | 3.525 |
| 0.8618055555555556 | 3.525 |
| 0.8624999999999999 | 3.525 |
| 0.8631944444444444 | 3.525 |
| 0.8638888888888889 | 3.525 |
| 0.8645833333333334 | 0 |
| 0.8652777777777777 | 0 |
| 0.8659722222222223 | 0 |
| 0.8666666666666667 | 0 |
| 0.8673611111111111 | 0 |
| 0.8680555555555555 | 0 |
| 0.86875 | 0 |
| 0.8694444444444445 | 0 |
| 0.8701388888888889 | 0 |
| 0.8708333333333332 | 0 |
| 0.8715277777777778 | 0 |
| 0.8722222222222222 | 0 |
| 0.8729166666666667 | 0 |
| 0.873611111111111 | 0 |
| 0.8743055555555556 | 0 |
| 0.875 | 0 |
| 0.8756944444444444 | 0 |
| 0.876388888888889 | 0 |
| 0.8770833333333333 | 0 |
| 0.8777777777777778 | 0 |
| 0.8784722222222222 | 0 |
| 0.8791666666666668 | 0 |
| 0.8798611111111111 | 0 |
| 0.8805555555555555 | 0 |
| 0.88125 | 0 |
| 0.8819444444444445 | 0 |
| 0.8826388888888889 | 0 |
| 0.8833333333333333 | 0 |
| 0.8840277777777777 | 0 |
| 0.8847222222222223 | 0 |
| 0.8854166666666666 | 0 |
| 0.8861111111111111 | 0 |
| 0.8868055555555556 | 0 |
| 0.8875000000000001 | 0 |
| 0.8881944444444444 | 0 |
| 0.8888888888888888 | 0 |
| 0.8895833333333334 | 0 |
| 0.8902777777777778 | 0 |
| 0.8909722222222222 | 0 |
| 0.8916666666666666 | 0 |
| 0.8923611111111112 | 0 |
| 0.8930555555555556 | 0 |
| 0.8937499999999999 | 0 |
| 0.8944444444444444 | 0 |
| 0.8951388888888889 | 0 |
| 0.8958333333333334 | 0 |
| 0.8965277777777777 | 0 |
| 0.8972222222222223 | 0 |
| 0.8979166666666667 | 0 |
| 0.8986111111111111 | 0 |
| 0.8993055555555555 | 0 |
| 0.9 | 0 |
| 0.9006944444444445 | 0 |
| 0.9013888888888889 | 0 |
| 0.9020833333333332 | 0 |
| 0.9027777777777778 | 0 |
| 0.9034722222222222 | 0 |
| 0.9041666666666667 | 0 |
| 0.904861111111111 | 0 |
| 0.9055555555555556 | 0 |
| 0.90625 | 0 |
| 0.9069444444444444 | 0 |
| 0.907638888888889 | 0 |
| 0.9083333333333333 | 0 |
| 0.9090277777777778 | 0 |
| 0.9097222222222222 | 0 |
| 0.9104166666666668 | 0 |
| 0.9111111111111111 | 0 |
| 0.9118055555555555 | 0 |
| 0.9125 | 0 |
| 0.9131944444444445 | 0 |
| 0.9138888888888889 | 0 |
| 0.9145833333333333 | 0 |
| 0.9152777777777777 | 0 |
| 0.9159722222222223 | 0 |
| 0.9166666666666666 | 0 |
| 0.9173611111111111 | 0 |
| 0.9180555555555556 | 0 |
| 0.9187500000000001 | 0 |
| 0.9194444444444444 | 0 |
| 0.9201388888888888 | 0 |
| 0.9208333333333334 | 0 |
| 0.9215277777777778 | 0 |
| 0.9222222222222222 | 0 |
| 0.9229166666666666 | 0 |
| 0.9236111111111112 | 0 |
| 0.9243055555555556 | 0 |
| 0.9249999999999999 | 0 |
| 0.9256944444444444 | 0 |
| 0.9263888888888889 | 0 |
| 0.9270833333333334 | 0 |
| 0.9277777777777777 | 0 |
| 0.9284722222222223 | 0 |
| 0.9291666666666667 | 0 |
| 0.9298611111111111 | 0 |
| 0.9305555555555555 | 0 |
| 0.93125 | 0 |
| 0.9319444444444445 | 0 |
| 0.9326388888888889 | 0 |
| 0.9333333333333332 | 0 |
| 0.9340277777777778 | 0 |
| 0.9347222222222222 | 0 |
| 0.9354166666666667 | 0 |
| 0.936111111111111 | 0 |
| 0.9368055555555556 | 0 |
| 0.9375 | 0 |
| 0.9381944444444444 | 0 |
| 0.938888888888889 | 0 |
| 0.9395833333333333 | 0 |
| 0.9402777777777778 | 0 |
| 0.9409722222222222 | 0 |
| 0.9416666666666668 | 0 |
| 0.9423611111111111 | 0 |
| 0.9430555555555555 | 0 |
| 0.94375 | 0 |
| 0.9444444444444445 | 0 |
| 0.9451388888888889 | 0 |
| 0.9458333333333333 | 0 |
| 0.9465277777777777 | 0 |
| 0.9472222222222223 | 0 |
| 0.9479166666666666 | 0 |
| 0.9486111111111111 | 0 |
| 0.9493055555555556 | 0 |
| 0.9500000000000001 | 0 |
| 0.9506944444444444 | 0 |
| 0.9513888888888888 | 0 |
| 0.9520833333333334 | 0 |
| 0.9527777777777778 | 0 |
| 0.9534722222222222 | 0 |
| 0.9541666666666666 | 0 |
| 0.9548611111111112 | 0 |
| 0.9555555555555556 | 0 |
| 0.9562499999999999 | 0 |
| 0.9569444444444444 | 0 |
| 0.9576388888888889 | 0 |
| 0.9583333333333334 | 0 |
| 0.9590277777777777 | 0 |
| 0.9597222222222223 | 0 |
| 0.9604166666666667 | 0 |
| 0.9611111111111111 | 0 |
| 0.9618055555555555 | 0 |
| 0.9625 | 0 |
| 0.9631944444444445 | 0 |
| 0.9638888888888889 | 0 |
| 0.9645833333333332 | 0 |
| 0.9652777777777778 | 0 |
| 0.9659722222222222 | 0 |
| 0.9666666666666667 | 0 |
| 0.967361111111111 | 0 |
| 0.9680555555555556 | 0 |
| 0.96875 | 0 |
| 0.9694444444444444 | 0 |
| 0.970138888888889 | 0 |
| 0.9708333333333333 | 0 |
| 0.9715277777777778 | 0 |
| 0.9722222222222222 | 0 |
| 0.9729166666666668 | 0 |
| 0.9736111111111111 | 0 |
| 0.9743055555555555 | 0 |
| 0.975 | 0 |
| 0.9756944444444445 | 0 |
| 0.9763888888888889 | 0 |
| 0.9770833333333333 | 0 |
| 0.9777777777777777 | 0 |
| 0.9784722222222223 | 0 |
| 0.9791666666666666 | 0 |
| 0.9798611111111111 | 0 |
| 0.9805555555555556 | 0 |
| 0.9812500000000001 | 0 |
| 0.9819444444444444 | 0 |
| 0.9826388888888888 | 0 |
| 0.9833333333333334 | 0 |
| 0.9840277777777778 | 0 |
| 0.9847222222222222 | 0 |
| 0.9854166666666666 | 0 |
| 0.9861111111111112 | 0 |
| 0.9868055555555556 | 0 |
| 0.9874999999999999 | 0 |
| 0.9881944444444444 | 0 |
| 0.9888888888888889 | 0 |
| 0.9895833333333334 | 0 |
| 0.9902777777777777 | 0 |
| 0.9909722222222223 | 0 |
| 0.9916666666666667 | 0 |
| 0.9923611111111111 | 0 |
| 0.9930555555555555 | 0 |
| 0.99375 | 0 |
| 0.9944444444444445 | 0 |
| 0.9951388888888889 | 0 |
| 0.9958333333333332 | 0 |
| 0.9965277777777778 | 0 |
| 0.9972222222222222 | 0 |
| 0.9979166666666667 | 0 |
| 0.998611111111111 | 0 |
| 0.9993055555555556 | 0 |